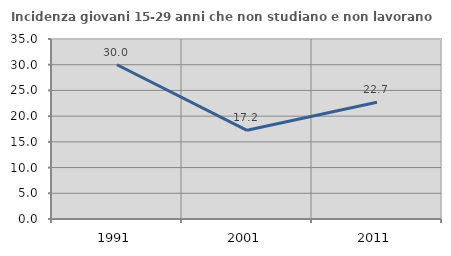
| Category | Incidenza giovani 15-29 anni che non studiano e non lavorano  |
|---|---|
| 1991.0 | 30 |
| 2001.0 | 17.241 |
| 2011.0 | 22.699 |